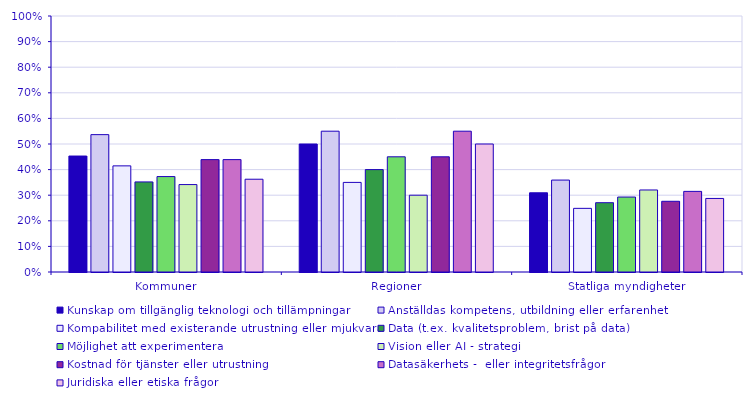
| Category | Kunskap om tillgänglig teknologi och tillämpningar | Anställdas kompetens, utbildning eller erfarenhet | Kompabilitet med existerande utrustning eller mjukvara | Data (t.ex. kvalitetsproblem, brist på data) | Möjlighet att experimentera | Vision eller AI - strategi | Kostnad för tjänster eller utrustning | Datasäkerhets -  eller integritetsfrågor | Juridiska eller etiska frågor |
|---|---|---|---|---|---|---|---|---|---|
| Kommuner | 0.453 | 0.537 | 0.415 | 0.352 | 0.373 | 0.342 | 0.439 | 0.439 | 0.362 |
| Regioner | 0.5 | 0.55 | 0.35 | 0.4 | 0.45 | 0.3 | 0.45 | 0.55 | 0.5 |
| Statliga myndigheter | 0.309 | 0.359 | 0.249 | 0.271 | 0.293 | 0.32 | 0.276 | 0.315 | 0.287 |